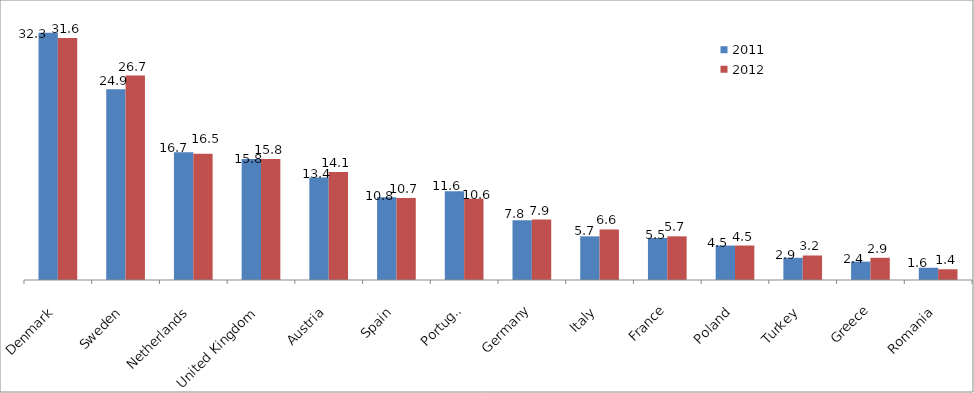
| Category | 2011 | 2012 |
|---|---|---|
| Denmark | 32.3 | 31.6 |
| Sweden | 24.9 | 26.7 |
| Netherlands | 16.7 | 16.5 |
| United Kingdom | 15.8 | 15.8 |
| Austria | 13.4 | 14.1 |
| Spain | 10.8 | 10.7 |
| Portugal | 11.6 | 10.6 |
| Germany | 7.8 | 7.9 |
| Italy | 5.7 | 6.6 |
| France | 5.5 | 5.7 |
| Poland | 4.5 | 4.5 |
| Turkey | 2.9 | 3.2 |
| Greece | 2.4 | 2.9 |
| Romania | 1.6 | 1.4 |